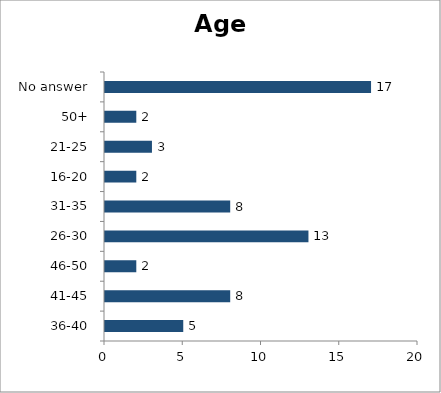
| Category | Age |
|---|---|
| 36-40 | 5 |
| 41-45 | 8 |
| 46-50 | 2 |
| 26-30 | 13 |
| 31-35 | 8 |
| 16-20 | 2 |
| 21-25 | 3 |
| 50+ | 2 |
| No answer | 17 |